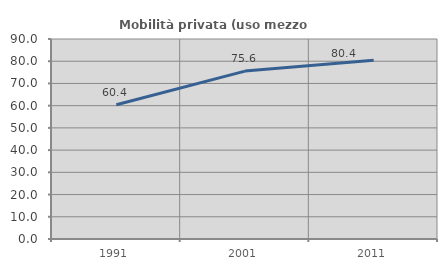
| Category | Mobilità privata (uso mezzo privato) |
|---|---|
| 1991.0 | 60.44 |
| 2001.0 | 75.556 |
| 2011.0 | 80.429 |